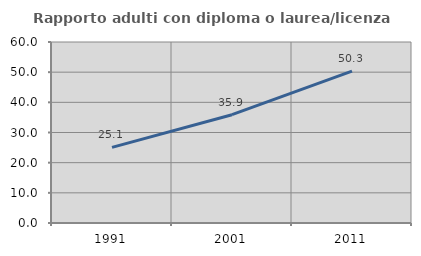
| Category | Rapporto adulti con diploma o laurea/licenza media  |
|---|---|
| 1991.0 | 25.065 |
| 2001.0 | 35.897 |
| 2011.0 | 50.338 |